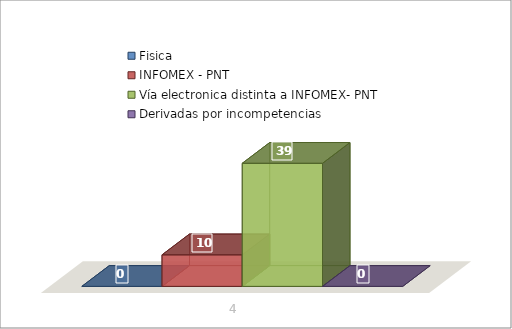
| Category | Fisica | INFOMEX - PNT | Vía electronica distinta a INFOMEX- PNT | Derivadas por incompetencias |
|---|---|---|---|---|
| 0 | 0 | 10 | 39 | 0 |